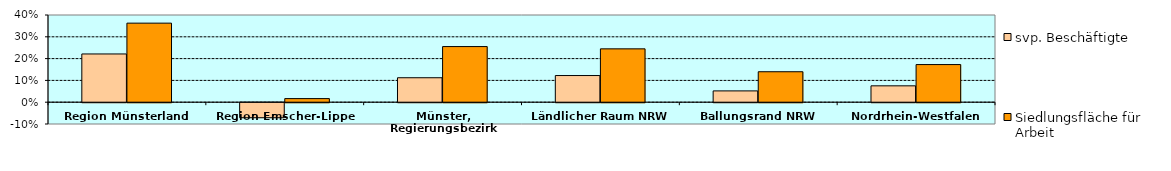
| Category | svp. Beschäftigte | Siedlungsfläche für Arbeit |
|---|---|---|
| Region Münsterland | 0.221 | 0.363 |
| Region Emscher-Lippe | -0.069 | 0.016 |
| Münster, Regierungsbezirk | 0.112 | 0.255 |
| Ländlicher Raum NRW | 0.122 | 0.245 |
| Ballungsrand NRW | 0.052 | 0.14 |
| Nordrhein-Westfalen | 0.075 | 0.173 |